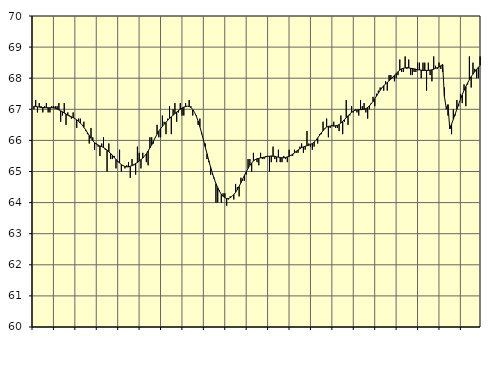
| Category | Piggar | Series 1 |
|---|---|---|
| nan | 67 | 67.1 |
| 1.0 | 67.3 | 67.09 |
| 1.0 | 66.9 | 67.08 |
| 1.0 | 67.2 | 67.07 |
| 1.0 | 67.1 | 67.06 |
| 1.0 | 66.9 | 67.06 |
| 1.0 | 67.1 | 67.05 |
| 1.0 | 67.2 | 67.05 |
| 1.0 | 66.9 | 67.05 |
| 1.0 | 66.9 | 67.05 |
| 1.0 | 67.1 | 67.05 |
| 1.0 | 67.1 | 67.05 |
| nan | 67.1 | 67.03 |
| 2.0 | 67.1 | 67.01 |
| 2.0 | 67.2 | 66.98 |
| 2.0 | 66.6 | 66.95 |
| 2.0 | 66.8 | 66.92 |
| 2.0 | 67.2 | 66.88 |
| 2.0 | 66.5 | 66.85 |
| 2.0 | 66.9 | 66.81 |
| 2.0 | 66.8 | 66.78 |
| 2.0 | 66.7 | 66.76 |
| 2.0 | 66.9 | 66.73 |
| 2.0 | 66.7 | 66.7 |
| nan | 66.4 | 66.66 |
| 3.0 | 66.7 | 66.62 |
| 3.0 | 66.7 | 66.56 |
| 3.0 | 66.5 | 66.5 |
| 3.0 | 66.6 | 66.42 |
| 3.0 | 66.3 | 66.34 |
| 3.0 | 66.2 | 66.25 |
| 3.0 | 65.9 | 66.16 |
| 3.0 | 66.4 | 66.07 |
| 3.0 | 66.1 | 65.99 |
| 3.0 | 65.7 | 65.93 |
| 3.0 | 65.9 | 65.88 |
| nan | 65.8 | 65.85 |
| 4.0 | 65.5 | 65.82 |
| 4.0 | 65.9 | 65.8 |
| 4.0 | 66.1 | 65.77 |
| 4.0 | 65.7 | 65.73 |
| 4.0 | 65 | 65.69 |
| 4.0 | 65.9 | 65.63 |
| 4.0 | 65.4 | 65.58 |
| 4.0 | 65.4 | 65.52 |
| 4.0 | 65.5 | 65.45 |
| 4.0 | 65.1 | 65.39 |
| 4.0 | 65.3 | 65.33 |
| nan | 65.7 | 65.27 |
| 5.0 | 65 | 65.22 |
| 5.0 | 65.2 | 65.19 |
| 5.0 | 65.1 | 65.16 |
| 5.0 | 65.2 | 65.15 |
| 5.0 | 65.3 | 65.15 |
| 5.0 | 64.8 | 65.17 |
| 5.0 | 65.4 | 65.19 |
| 5.0 | 65.2 | 65.22 |
| 5.0 | 64.9 | 65.26 |
| 5.0 | 65.8 | 65.29 |
| 5.0 | 65.6 | 65.34 |
| nan | 65.1 | 65.38 |
| 6.0 | 65.6 | 65.43 |
| 6.0 | 65.5 | 65.5 |
| 6.0 | 65.3 | 65.57 |
| 6.0 | 65.2 | 65.66 |
| 6.0 | 66.1 | 65.76 |
| 6.0 | 66.1 | 65.86 |
| 6.0 | 65.9 | 65.98 |
| 6.0 | 66.1 | 66.09 |
| 6.0 | 66.5 | 66.2 |
| 6.0 | 66.1 | 66.3 |
| 6.0 | 66.1 | 66.38 |
| nan | 66.8 | 66.45 |
| 7.0 | 66.6 | 66.52 |
| 7.0 | 66.2 | 66.58 |
| 7.0 | 66.7 | 66.65 |
| 7.0 | 67.1 | 66.71 |
| 7.0 | 66.2 | 66.76 |
| 7.0 | 67 | 66.81 |
| 7.0 | 67.2 | 66.86 |
| 7.0 | 66.6 | 66.91 |
| 7.0 | 66.9 | 66.96 |
| 7.0 | 67.2 | 67 |
| 7.0 | 66.8 | 67.04 |
| nan | 66.8 | 67.07 |
| 8.0 | 67.2 | 67.09 |
| 8.0 | 67.1 | 67.1 |
| 8.0 | 67.3 | 67.09 |
| 8.0 | 67.1 | 67.06 |
| 8.0 | 66.8 | 66.99 |
| 8.0 | 66.9 | 66.9 |
| 8.0 | 66.8 | 66.78 |
| 8.0 | 66.5 | 66.62 |
| 8.0 | 66.7 | 66.44 |
| 8.0 | 66.2 | 66.23 |
| 8.0 | 66 | 66.01 |
| nan | 65.9 | 65.79 |
| 9.0 | 65.4 | 65.57 |
| 9.0 | 65.3 | 65.35 |
| 9.0 | 64.9 | 65.14 |
| 9.0 | 64.9 | 64.95 |
| 9.0 | 64.8 | 64.77 |
| 9.0 | 64 | 64.61 |
| 9.0 | 64 | 64.48 |
| 9.0 | 64.4 | 64.36 |
| 9.0 | 64 | 64.27 |
| 9.0 | 64.3 | 64.2 |
| 9.0 | 64.3 | 64.16 |
| nan | 63.9 | 64.13 |
| 10.0 | 64.1 | 64.13 |
| 10.0 | 64.2 | 64.16 |
| 10.0 | 64.2 | 64.2 |
| 10.0 | 64.1 | 64.26 |
| 10.0 | 64.6 | 64.33 |
| 10.0 | 64.5 | 64.42 |
| 10.0 | 64.2 | 64.52 |
| 10.0 | 64.8 | 64.64 |
| 10.0 | 64.7 | 64.76 |
| 10.0 | 64.7 | 64.88 |
| 10.0 | 64.9 | 64.99 |
| nan | 65.4 | 65.1 |
| 11.0 | 65.4 | 65.2 |
| 11.0 | 65 | 65.27 |
| 11.0 | 65.6 | 65.34 |
| 11.0 | 65.4 | 65.38 |
| 11.0 | 65.3 | 65.41 |
| 11.0 | 65.2 | 65.42 |
| 11.0 | 65.6 | 65.44 |
| 11.0 | 65.4 | 65.45 |
| 11.0 | 65.4 | 65.46 |
| 11.0 | 65.5 | 65.47 |
| 11.0 | 65.5 | 65.49 |
| nan | 65 | 65.49 |
| 12.0 | 65.3 | 65.5 |
| 12.0 | 65.8 | 65.49 |
| 12.0 | 65.4 | 65.49 |
| 12.0 | 65.3 | 65.47 |
| 12.0 | 65.7 | 65.46 |
| 12.0 | 65.3 | 65.45 |
| 12.0 | 65.3 | 65.44 |
| 12.0 | 65.5 | 65.44 |
| 12.0 | 65.4 | 65.45 |
| 12.0 | 65.3 | 65.47 |
| 12.0 | 65.7 | 65.49 |
| nan | 65.5 | 65.52 |
| 13.0 | 65.5 | 65.56 |
| 13.0 | 65.7 | 65.6 |
| 13.0 | 65.6 | 65.65 |
| 13.0 | 65.6 | 65.69 |
| 13.0 | 65.8 | 65.73 |
| 13.0 | 65.9 | 65.77 |
| 13.0 | 65.6 | 65.79 |
| 13.0 | 65.7 | 65.81 |
| 13.0 | 66.3 | 65.83 |
| 13.0 | 65.9 | 65.84 |
| 13.0 | 65.8 | 65.87 |
| nan | 65.7 | 65.9 |
| 14.0 | 65.8 | 65.95 |
| 14.0 | 66 | 66 |
| 14.0 | 65.9 | 66.08 |
| 14.0 | 66.2 | 66.16 |
| 14.0 | 66.2 | 66.24 |
| 14.0 | 66.6 | 66.31 |
| 14.0 | 66.4 | 66.38 |
| 14.0 | 66.7 | 66.43 |
| 14.0 | 66.1 | 66.45 |
| 14.0 | 66.4 | 66.46 |
| 14.0 | 66.5 | 66.47 |
| nan | 66.6 | 66.46 |
| 15.0 | 66.4 | 66.47 |
| 15.0 | 66.4 | 66.48 |
| 15.0 | 66.3 | 66.51 |
| 15.0 | 66.8 | 66.56 |
| 15.0 | 66.2 | 66.61 |
| 15.0 | 66.6 | 66.67 |
| 15.0 | 67.3 | 66.73 |
| 15.0 | 66.5 | 66.79 |
| 15.0 | 66.8 | 66.85 |
| 15.0 | 67.1 | 66.9 |
| 15.0 | 66.9 | 66.94 |
| nan | 67 | 66.97 |
| 16.0 | 66.9 | 66.98 |
| 16.0 | 66.8 | 66.99 |
| 16.0 | 67.3 | 66.99 |
| 16.0 | 67.1 | 66.99 |
| 16.0 | 67.2 | 67 |
| 16.0 | 66.9 | 67.02 |
| 16.0 | 66.7 | 67.06 |
| 16.0 | 67 | 67.11 |
| 16.0 | 67.2 | 67.18 |
| 16.0 | 67.4 | 67.25 |
| 16.0 | 67.1 | 67.34 |
| nan | 67.5 | 67.43 |
| 17.0 | 67.6 | 67.52 |
| 17.0 | 67.7 | 67.61 |
| 17.0 | 67.7 | 67.69 |
| 17.0 | 67.6 | 67.76 |
| 17.0 | 67.9 | 67.81 |
| 17.0 | 67.6 | 67.87 |
| 17.0 | 68.1 | 67.92 |
| 17.0 | 68.1 | 67.97 |
| 17.0 | 68 | 68.03 |
| 17.0 | 67.9 | 68.09 |
| 17.0 | 68 | 68.15 |
| nan | 68.1 | 68.21 |
| 18.0 | 68.6 | 68.26 |
| 18.0 | 68.2 | 68.3 |
| 18.0 | 68.2 | 68.32 |
| 18.0 | 68.7 | 68.33 |
| 18.0 | 68.3 | 68.34 |
| 18.0 | 68.6 | 68.33 |
| 18.0 | 68.1 | 68.32 |
| 18.0 | 68.1 | 68.31 |
| 18.0 | 68.2 | 68.3 |
| 18.0 | 68.2 | 68.29 |
| 18.0 | 68.5 | 68.27 |
| nan | 68.5 | 68.27 |
| 19.0 | 68 | 68.26 |
| 19.0 | 68.5 | 68.25 |
| 19.0 | 68.5 | 68.25 |
| 19.0 | 67.6 | 68.25 |
| 19.0 | 68.5 | 68.25 |
| 19.0 | 68.1 | 68.26 |
| 19.0 | 67.9 | 68.27 |
| 19.0 | 68.7 | 68.29 |
| 19.0 | 68.4 | 68.32 |
| 19.0 | 68.3 | 68.34 |
| 19.0 | 68.5 | 68.36 |
| nan | 68.3 | 68.4 |
| 20.0 | 68.2 | 68.44 |
| 20.0 | 67.7 | 67.41 |
| 20.0 | 67 | 67.04 |
| 20.0 | 66.8 | 67.15 |
| 20.0 | 66.4 | 66.37 |
| 20.0 | 66.2 | 66.52 |
| 20.0 | 67 | 66.68 |
| 20.0 | 66.8 | 66.84 |
| 20.0 | 67.3 | 67.01 |
| 20.0 | 67.1 | 67.17 |
| 20.0 | 67.5 | 67.32 |
| nan | 67.2 | 67.47 |
| 21.0 | 67.8 | 67.61 |
| 21.0 | 67.1 | 67.73 |
| 21.0 | 67.8 | 67.85 |
| 21.0 | 68.7 | 67.95 |
| 21.0 | 67.7 | 68.05 |
| 21.0 | 68.5 | 68.13 |
| 21.0 | 68.3 | 68.21 |
| 21.0 | 68 | 68.28 |
| 21.0 | 68 | 68.35 |
| 21.0 | 68.7 | 68.41 |